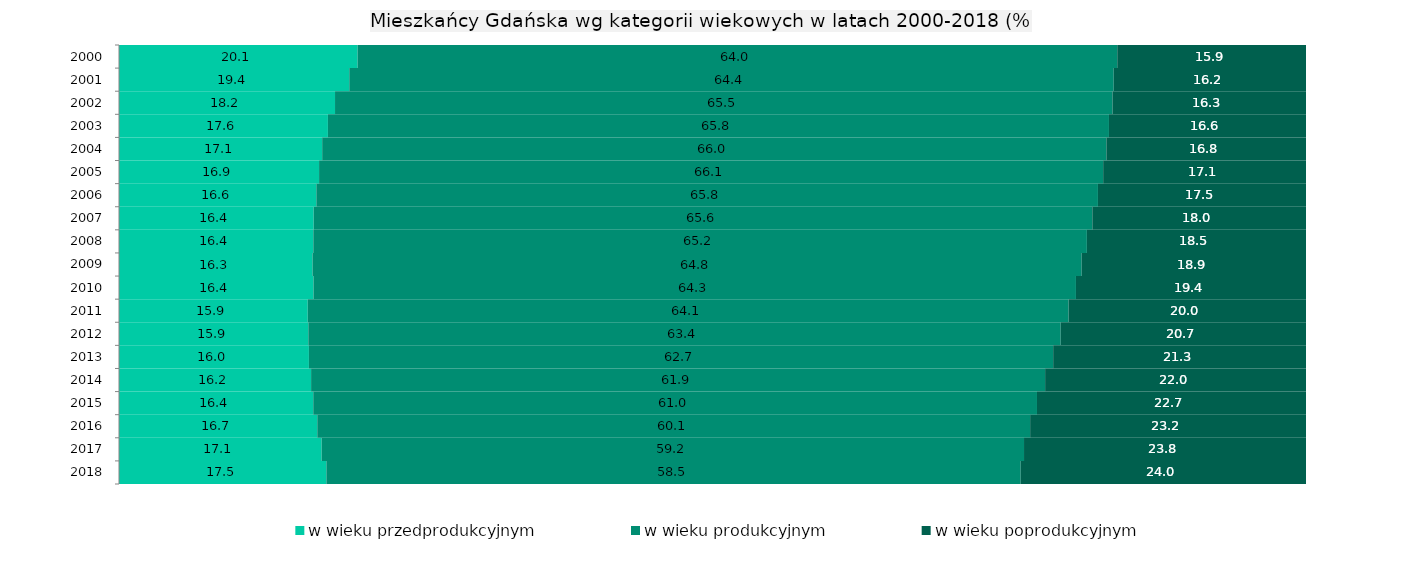
| Category | w wieku przedprodukcyjnym | w wieku produkcyjnym | w wieku poprodukcyjnym |
|---|---|---|---|
| 2000.0 | 20.1 | 64 | 15.9 |
| 2001.0 | 19.4 | 64.4 | 16.2 |
| 2002.0 | 18.2 | 65.5 | 16.3 |
| 2003.0 | 17.6 | 65.8 | 16.6 |
| 2004.0 | 17.1 | 66 | 16.8 |
| 2005.0 | 16.856 | 66.056 | 17.088 |
| 2006.0 | 16.625 | 65.847 | 17.528 |
| 2007.0 | 16.4 | 65.6 | 18 |
| 2008.0 | 16.37 | 65.17 | 18.46 |
| 2009.0 | 16.3 | 64.8 | 18.9 |
| 2010.0 | 16.4 | 64.3 | 19.4 |
| 2011.0 | 15.9 | 64.1 | 20 |
| 2012.0 | 15.949 | 63.381 | 20.67 |
| 2013.0 | 16 | 62.7 | 21.3 |
| 2014.0 | 16.2 | 61.9 | 22 |
| 2015.0 | 16.365 | 60.971 | 22.663 |
| 2016.0 | 16.704 | 60.056 | 23.24 |
| 2017.0 | 17.071 | 59.174 | 23.755 |
| 2018.0 | 17.47 | 58.491 | 24.039 |